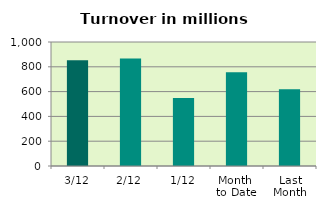
| Category | Series 0 |
|---|---|
| 3/12 | 852.732 |
| 2/12 | 867.88 |
| 1/12 | 547.807 |
| Month 
to Date | 756.139 |
| Last
Month | 619.399 |